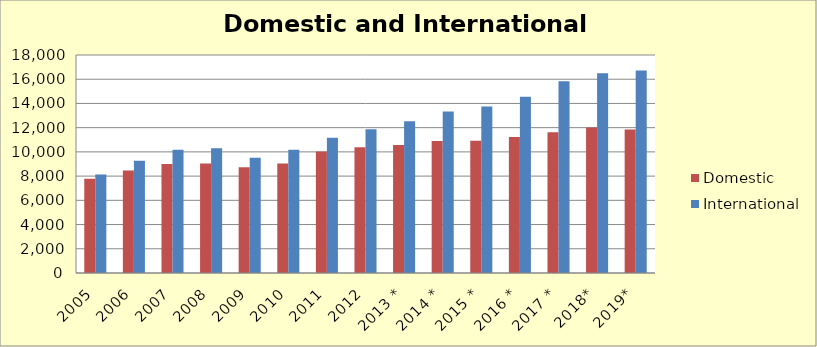
| Category | Domestic | International |
|---|---|---|
| 2005 | 7776.484 | 8129.961 |
| 2006 | 8471.474 | 9266.136 |
| 2007 | 8998.15 | 10171.366 |
| 2008 | 9034.773 | 10310.471 |
| 2009 | 8736.598 | 9520.719 |
| 2010 | 9045.698 | 10186.197 |
| 2011 | 10040.497 | 11173.569 |
| 2012 | 10384.606 | 11871.732 |
| 2013 * | 10578.614 | 12536.197 |
| 2014 * | 10903.855 | 13326.325 |
| 2015 * | 10915.942 | 13740.817 |
| 2016 * | 11220.636 | 14545.61 |
| 2017 * | 11629.234 | 15828.363 |
| 2018* | 12008 | 16494 |
| 2019* | 11852 | 16720 |